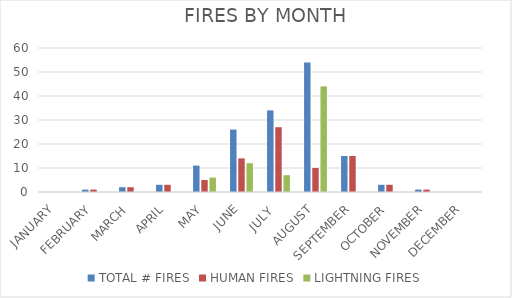
| Category | TOTAL # FIRES | HUMAN FIRES | LIGHTNING FIRES |
|---|---|---|---|
| JANUARY | 0 | 0 | 0 |
| FEBRUARY | 1 | 1 | 0 |
| MARCH | 2 | 2 | 0 |
| APRIL | 3 | 3 | 0 |
| MAY | 11 | 5 | 6 |
| JUNE | 26 | 14 | 12 |
| JULY  | 34 | 27 | 7 |
| AUGUST | 54 | 10 | 44 |
| SEPTEMBER | 15 | 15 | 0 |
| OCTOBER | 3 | 3 | 0 |
| NOVEMBER | 1 | 1 | 0 |
| DECEMBER | 0 | 0 | 0 |